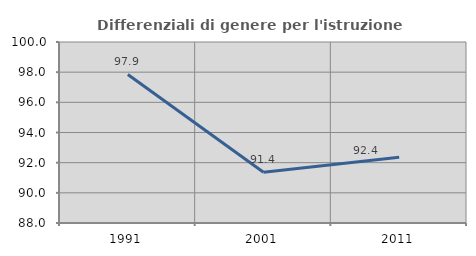
| Category | Differenziali di genere per l'istruzione superiore |
|---|---|
| 1991.0 | 97.851 |
| 2001.0 | 91.361 |
| 2011.0 | 92.357 |